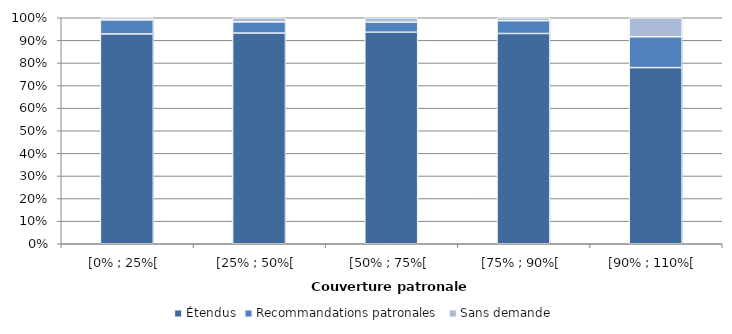
| Category | Étendus | Recommandations patronales | Sans demande |
|---|---|---|---|
| [0% ; 25%[ | 0.928 | 0.062 | 0.01 |
| [25% ; 50%[ | 0.932 | 0.049 | 0.018 |
| [50% ; 75%[ | 0.936 | 0.044 | 0.02 |
| [75% ; 90%[ | 0.93 | 0.057 | 0.013 |
| [90% ; 110%[ | 0.779 | 0.136 | 0.084 |